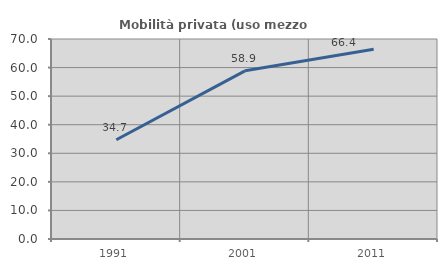
| Category | Mobilità privata (uso mezzo privato) |
|---|---|
| 1991.0 | 34.733 |
| 2001.0 | 58.867 |
| 2011.0 | 66.399 |